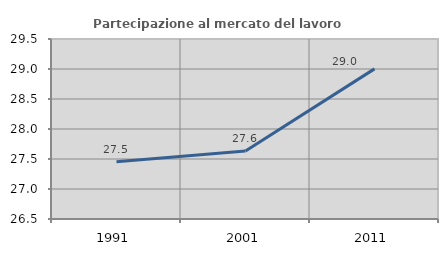
| Category | Partecipazione al mercato del lavoro  femminile |
|---|---|
| 1991.0 | 27.455 |
| 2001.0 | 27.632 |
| 2011.0 | 29.002 |